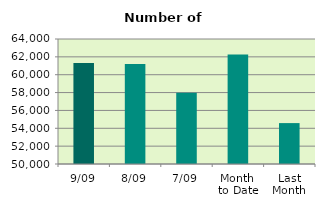
| Category | Series 0 |
|---|---|
| 9/09 | 61300 |
| 8/09 | 61202 |
| 7/09 | 57976 |
| Month 
to Date | 62263.143 |
| Last
Month | 54581.565 |